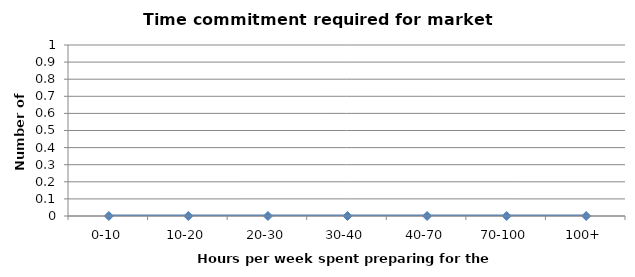
| Category | Series 0 |
|---|---|
| 0-10 | 0 |
| 10-20 | 0 |
| 20-30 | 0 |
| 30-40 | 0 |
| 40-70 | 0 |
| 70-100 | 0 |
| 100+ | 0 |